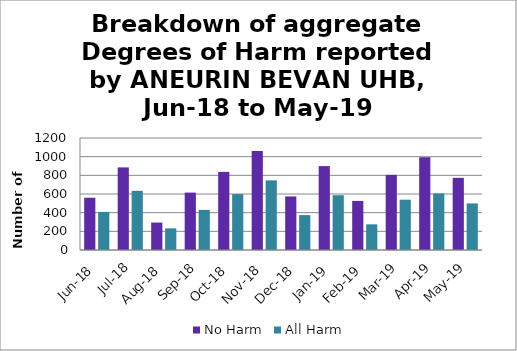
| Category | No Harm | All Harm |
|---|---|---|
| Jun-18 | 560 | 408 |
| Jul-18 | 885 | 634 |
| Aug-18 | 294 | 232 |
| Sep-18 | 615 | 430 |
| Oct-18 | 837 | 599 |
| Nov-18 | 1062 | 746 |
| Dec-18 | 574 | 374 |
| Jan-19 | 899 | 587 |
| Feb-19 | 526 | 275 |
| Mar-19 | 805 | 539 |
| Apr-19 | 994 | 606 |
| May-19 | 773 | 499 |